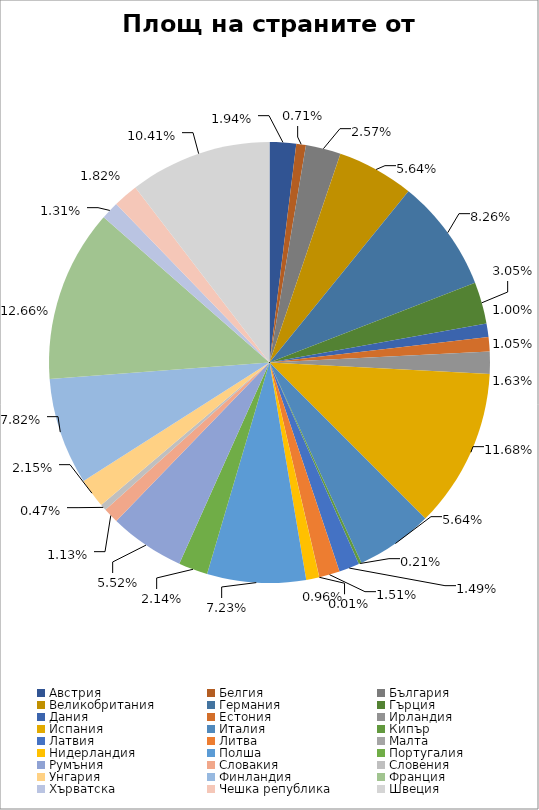
| Category | Площ (кв. км) |
|---|---|
| Австрия | 83858 |
| Белгия | 30518 |
| България  | 110994 |
| Великобритания | 243609 |
| Германия | 357021 |
| Гърция | 131957 |
| Дания | 43093 |
| Естония | 45226 |
| Ирландия | 70273 |
| Испания  | 504842 |
| Италия | 243609 |
| Кипър | 9251 |
| Латвия | 64598 |
| Литва  | 65300 |
| Малта | 315 |
| Нидерландия | 41526 |
| Полша  | 312685 |
| Португалия | 92391 |
| Румъния  | 238391 |
| Словакия  | 49034 |
| Словения  | 20273 |
| Унгария | 92966 |
| Финландия | 338145 |
| Франция | 547030 |
| Хърватска | 56542 |
| Чешка република | 78866 |
| Швеция  | 449965 |